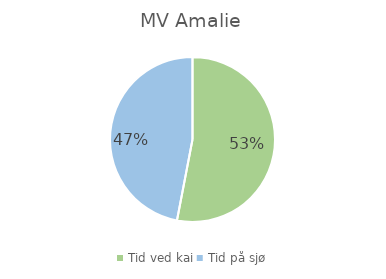
| Category | Series 0 |
|---|---|
| Tid ved kai | 0.53 |
| Tid på sjø | 0.47 |